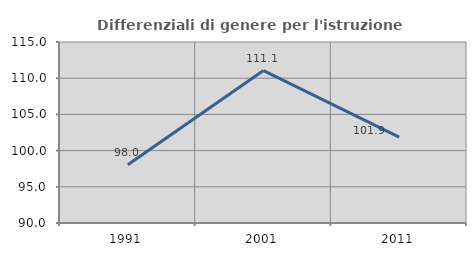
| Category | Differenziali di genere per l'istruzione superiore |
|---|---|
| 1991.0 | 98.049 |
| 2001.0 | 111.05 |
| 2011.0 | 101.871 |